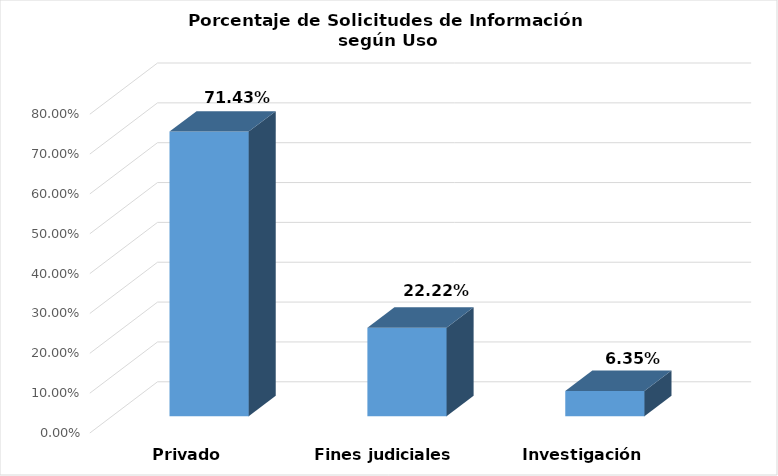
| Category | Series 0 |
|---|---|
| Privado | 0.714 |
| Fines judiciales | 0.222 |
| Investigación | 0.063 |